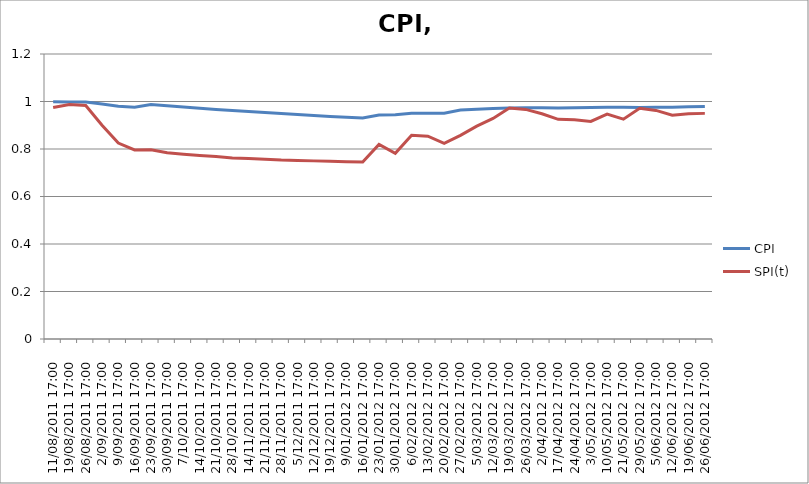
| Category | CPI | SPI(t) |
|---|---|---|
| 11/08/2011 17:00 | 0.999 | 0.975 |
| 19/08/2011 17:00 | 0.998 | 0.988 |
| 26/08/2011 17:00 | 0.998 | 0.983 |
| 2/09/2011 17:00 | 0.99 | 0.9 |
| 9/09/2011 17:00 | 0.98 | 0.825 |
| 16/09/2011 17:00 | 0.976 | 0.796 |
| 23/09/2011 17:00 | 0.987 | 0.796 |
| 30/09/2011 17:00 | 0.982 | 0.784 |
| 7/10/2011 17:00 | 0.977 | 0.778 |
| 14/10/2011 17:00 | 0.972 | 0.772 |
| 21/10/2011 17:00 | 0.967 | 0.768 |
| 28/10/2011 17:00 | 0.962 | 0.762 |
| 14/11/2011 17:00 | 0.958 | 0.76 |
| 21/11/2011 17:00 | 0.953 | 0.757 |
| 28/11/2011 17:00 | 0.949 | 0.753 |
| 5/12/2011 17:00 | 0.945 | 0.752 |
| 12/12/2011 17:00 | 0.941 | 0.75 |
| 19/12/2011 17:00 | 0.937 | 0.749 |
| 9/01/2012 17:00 | 0.934 | 0.746 |
| 16/01/2012 17:00 | 0.93 | 0.745 |
| 23/01/2012 17:00 | 0.943 | 0.819 |
| 30/01/2012 17:00 | 0.944 | 0.782 |
| 6/02/2012 17:00 | 0.95 | 0.858 |
| 13/02/2012 17:00 | 0.95 | 0.854 |
| 20/02/2012 17:00 | 0.951 | 0.824 |
| 27/02/2012 17:00 | 0.964 | 0.858 |
| 5/03/2012 17:00 | 0.967 | 0.896 |
| 12/03/2012 17:00 | 0.97 | 0.929 |
| 19/03/2012 17:00 | 0.973 | 0.972 |
| 26/03/2012 17:00 | 0.974 | 0.967 |
| 2/04/2012 17:00 | 0.973 | 0.948 |
| 17/04/2012 17:00 | 0.973 | 0.925 |
| 24/04/2012 17:00 | 0.973 | 0.923 |
| 3/05/2012 17:00 | 0.974 | 0.916 |
| 10/05/2012 17:00 | 0.976 | 0.947 |
| 21/05/2012 17:00 | 0.975 | 0.926 |
| 29/05/2012 17:00 | 0.975 | 0.972 |
| 5/06/2012 17:00 | 0.976 | 0.962 |
| 12/06/2012 17:00 | 0.976 | 0.942 |
| 19/06/2012 17:00 | 0.977 | 0.949 |
| 26/06/2012 17:00 | 0.979 | 0.95 |